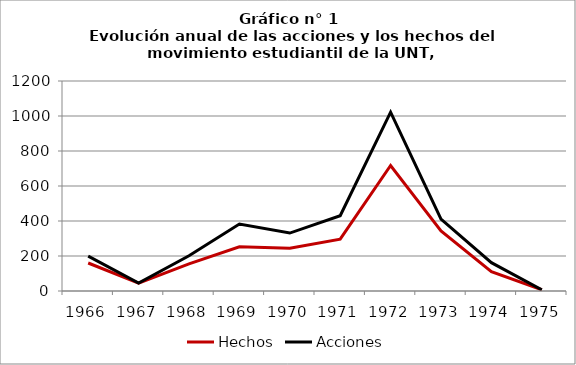
| Category | Hechos | Acciones |
|---|---|---|
| 1966.0 | 160 | 199 |
| 1967.0 | 45 | 45 |
| 1968.0 | 155 | 201 |
| 1969.0 | 253 | 383 |
| 1970.0 | 244 | 331 |
| 1971.0 | 296 | 430 |
| 1972.0 | 717 | 1022 |
| 1973.0 | 343 | 411 |
| 1974.0 | 111 | 162 |
| 1975.0 | 7 | 7 |